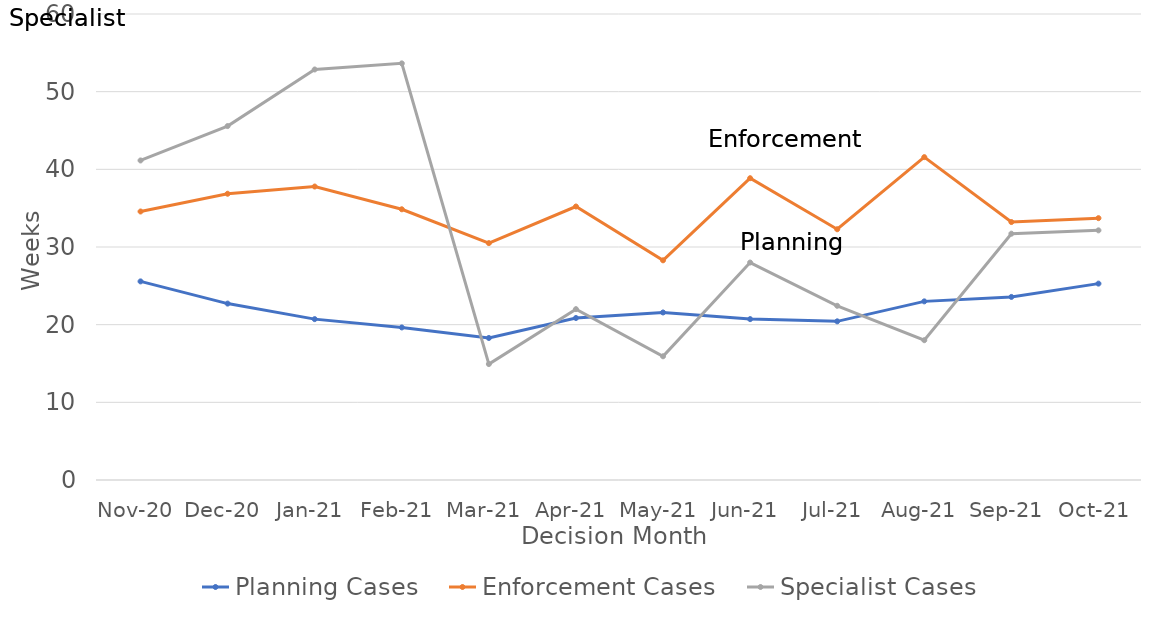
| Category | Planning Cases | Enforcement Cases | Specialist Cases |
|---|---|---|---|
| Nov-20 | 25.571 | 34.571 | 41.143 |
| Dec-20 | 22.714 | 36.857 | 45.571 |
| Jan-21 | 20.714 | 37.786 | 52.857 |
| Feb-21 | 19.643 | 34.857 | 53.643 |
| Mar-21 | 18.286 | 30.5 | 14.929 |
| Apr-21 | 20.857 | 35.214 | 22 |
| May-21 | 21.571 | 28.286 | 15.929 |
| Jun-21 | 20.714 | 38.857 | 28 |
| Jul-21 | 20.429 | 32.286 | 22.429 |
| Aug-21 | 23 | 41.571 | 18 |
| Sep-21 | 23.571 | 33.214 | 31.714 |
| Oct-21 | 25.286 | 33.714 | 32.143 |